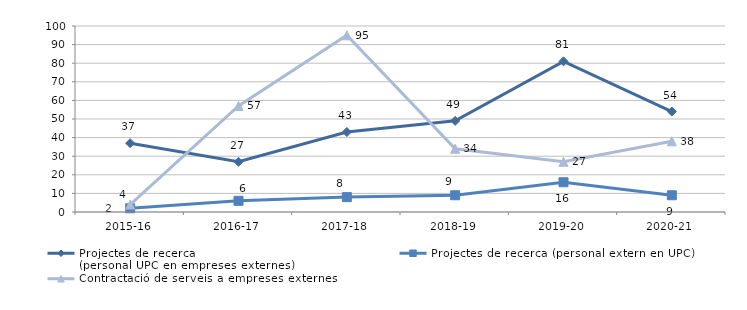
| Category | Projectes de recerca 
(personal UPC en empreses externes) | Projectes de recerca (personal extern en UPC) | Contractació de serveis a empreses externes |
|---|---|---|---|
| 2015-16 | 37 | 2 | 4 |
| 2016-17 | 27 | 6 | 57 |
| 2017-18 | 43 | 8 | 95 |
| 2018-19 | 49 | 9 | 34 |
| 2019-20 | 81 | 16 | 27 |
| 2020-21 | 54 | 9 | 38 |